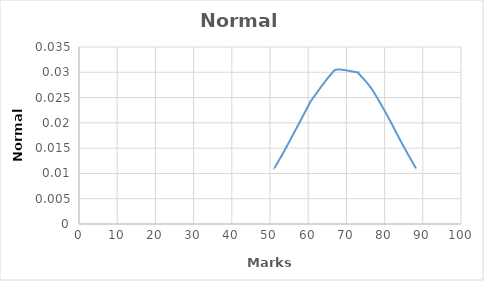
| Category | Normal  Distribution  |
|---|---|
| 51.2 | 0.011 |
| 51.4 | 0.011 |
| 54.4 | 0.015 |
| 60.0 | 0.023 |
| 61.0 | 0.025 |
| 66.0 | 0.03 |
| 67.8 | 0.031 |
| 72.8 | 0.03 |
| 73.2 | 0.03 |
| 76.6 | 0.027 |
| 80.8 | 0.021 |
| 84.2 | 0.016 |
| 87.8 | 0.012 |
| 88.2 | 0.011 |